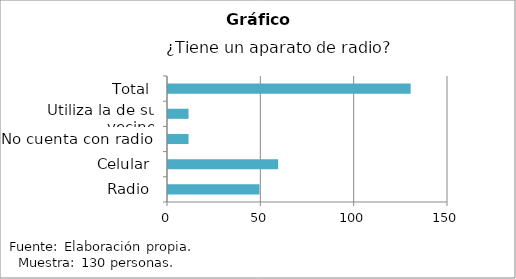
| Category | Series 0 |
|---|---|
| Radio | 49 |
| Celular | 59 |
| No cuenta con radio | 11 |
| Utiliza la de su vecino | 11 |
| Total | 130 |